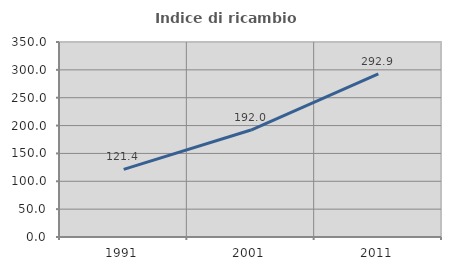
| Category | Indice di ricambio occupazionale  |
|---|---|
| 1991.0 | 121.429 |
| 2001.0 | 192.029 |
| 2011.0 | 292.857 |